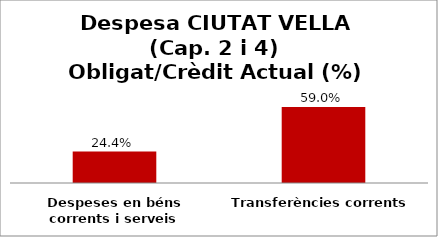
| Category | Series 0 |
|---|---|
| Despeses en béns corrents i serveis | 0.244 |
| Transferències corrents | 0.59 |